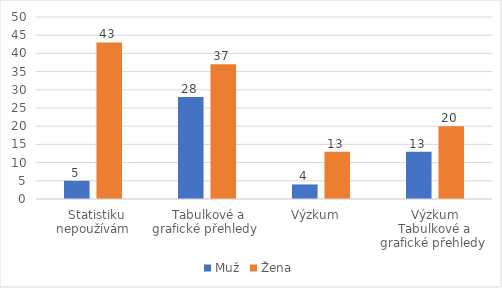
| Category | Muž | Žena |
|---|---|---|
|   Statistiku nepoužívám | 5 | 43 |
|  Tabulkové a grafické přehledy  | 28 | 37 |
| Výzkum   | 4 | 13 |
| Výzkum Tabulkové a grafické přehledy  | 13 | 20 |